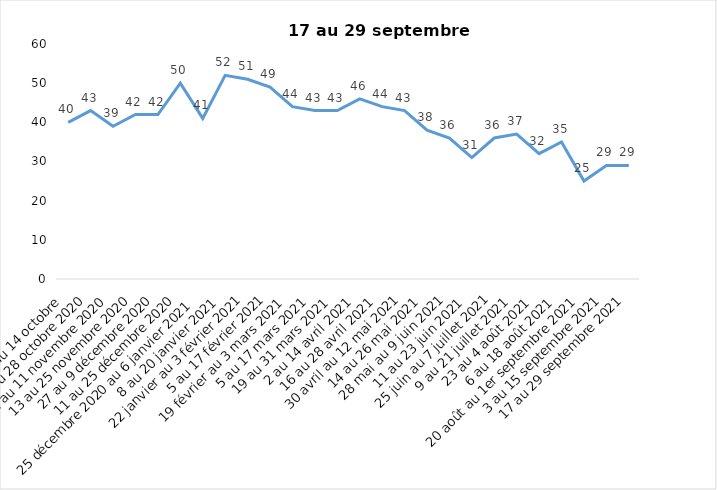
| Category | Toujours aux trois mesures |
|---|---|
| 2 au 14 octobre  | 40 |
| 16 au 28 octobre 2020 | 43 |
| 30 octobre au 11 novembre 2020 | 39 |
| 13 au 25 novembre 2020 | 42 |
| 27 au 9 décembre 2020 | 42 |
| 11 au 25 décembre 2020 | 50 |
| 25 décembre 2020 au 6 janvier 2021 | 41 |
| 8 au 20 janvier 2021 | 52 |
| 22 janvier au 3 février 2021 | 51 |
| 5 au 17 février 2021 | 49 |
| 19 février au 3 mars 2021 | 44 |
| 5 au 17 mars 2021 | 43 |
| 19 au 31 mars 2021 | 43 |
| 2 au 14 avril 2021 | 46 |
| 16 au 28 avril 2021 | 44 |
| 30 avril au 12 mai 2021 | 43 |
| 14 au 26 mai 2021 | 38 |
| 28 mai au 9 juin 2021 | 36 |
| 11 au 23 juin 2021 | 31 |
| 25 juin au 7 juillet 2021 | 36 |
| 9 au 21 juillet 2021 | 37 |
| 23 au 4 août 2021 | 32 |
| 6 au 18 août 2021 | 35 |
| 20 août au 1er septembre 2021 | 25 |
| 3 au 15 septembre 2021 | 29 |
| 17 au 29 septembre 2021 | 29 |